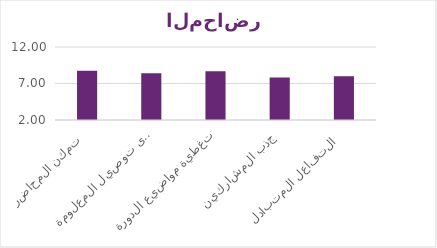
| Category | Series 0 |
|---|---|
|  تمكن المحاضر  | 8.75 |
|  القدرة على توصيل المعلومة  | 8.417 |
|  تغطية مواضيع الدورة | 8.667 |
|  جذب المشاركين | 7.833 |
|  التفاعل المتبادل  | 8 |